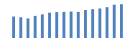
| Category | Exportações (1) |
|---|---|
| 0 | 595986.616 |
| 1 | 575965.577 |
| 2 | 544011.291 |
| 3 | 614380.205 |
| 4 | 656918.26 |
| 5 | 703504.835 |
| 6 | 720793.562 |
| 7 | 726284.803 |
| 8 | 735533.905 |
| 9 | 723973.625 |
| 10 | 778041 |
| 11 | 800341.537 |
| 12 | 819402.338 |
| 13 | 856189.676 |
| 14 | 925952.679 |
| 15 | 939552.052 |